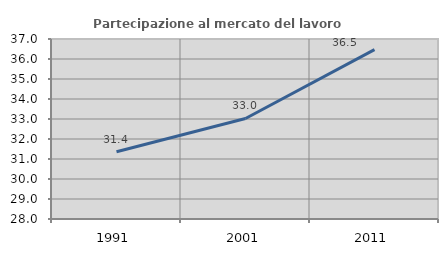
| Category | Partecipazione al mercato del lavoro  femminile |
|---|---|
| 1991.0 | 31.366 |
| 2001.0 | 33.026 |
| 2011.0 | 36.472 |